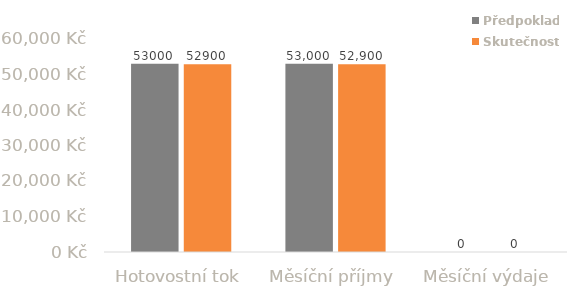
| Category | Předpoklad | Skutečnost |
|---|---|---|
| Hotovostní tok | 53000 | 52900 |
| Měsíční příjmy | 53000 | 52900 |
| Měsíční výdaje | 0 | 0 |